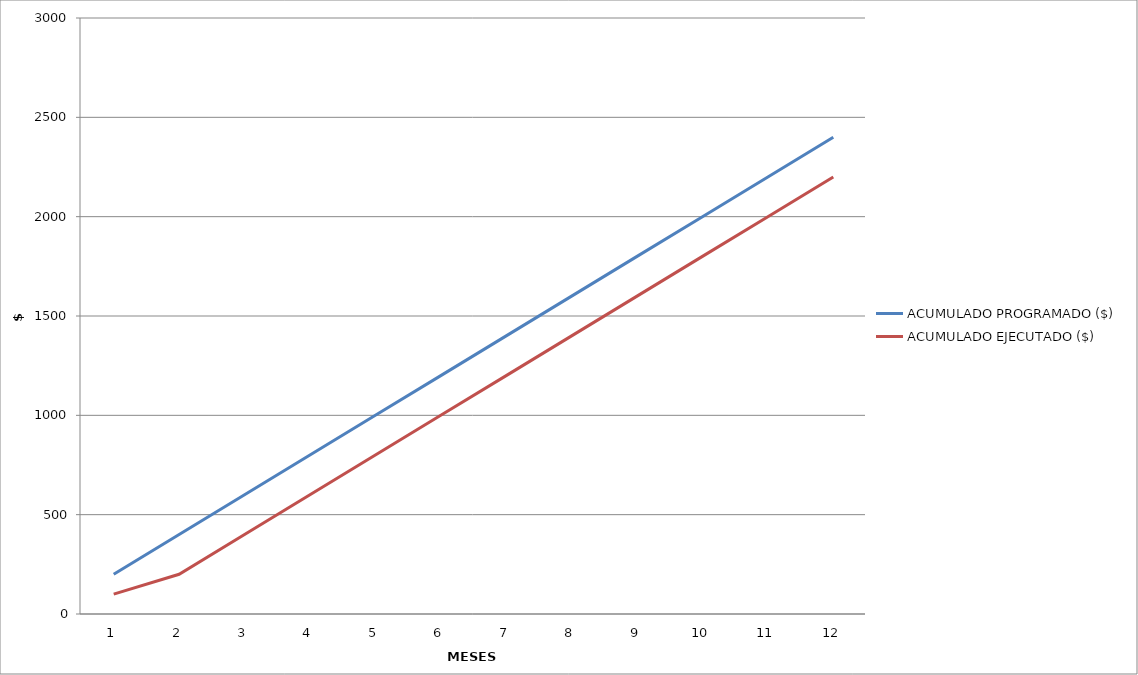
| Category | ACUMULADO PROGRAMADO ($) | ACUMULADO EJECUTADO ($) |
|---|---|---|
| 1 | 200 | 100 |
| 2 | 400 | 200 |
| 3 | 600 | 400 |
| 4 | 800 | 600 |
| 5 | 1000 | 800 |
| 6 | 1200 | 1000 |
| 7 | 1400 | 1200 |
| 8 | 1600 | 1400 |
| 9 | 1800 | 1600 |
| 10 | 2000 | 1800 |
| 11 | 2200 | 2000 |
| 12 | 2400 | 2200 |